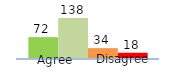
| Category | Series 0 | Series 1 | Series 2 | Series 3 |
|---|---|---|---|---|
| 0 | 72 | 138 | 34 | 18 |